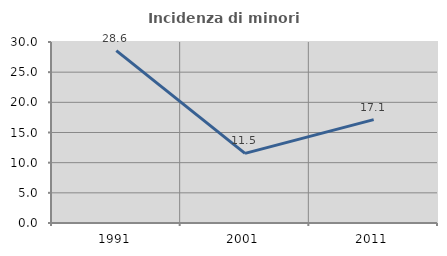
| Category | Incidenza di minori stranieri |
|---|---|
| 1991.0 | 28.571 |
| 2001.0 | 11.538 |
| 2011.0 | 17.131 |